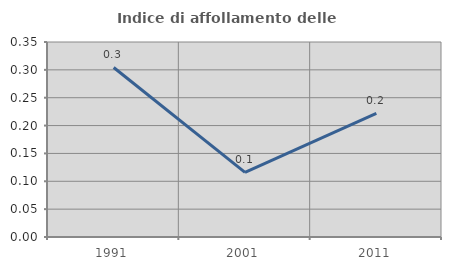
| Category | Indice di affollamento delle abitazioni  |
|---|---|
| 1991.0 | 0.304 |
| 2001.0 | 0.116 |
| 2011.0 | 0.222 |